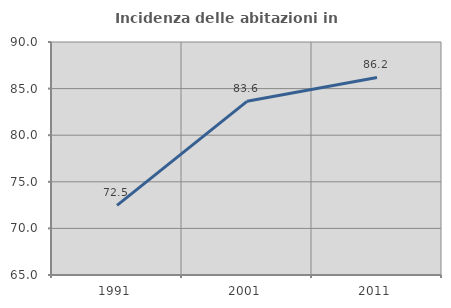
| Category | Incidenza delle abitazioni in proprietà  |
|---|---|
| 1991.0 | 72.467 |
| 2001.0 | 83.633 |
| 2011.0 | 86.201 |